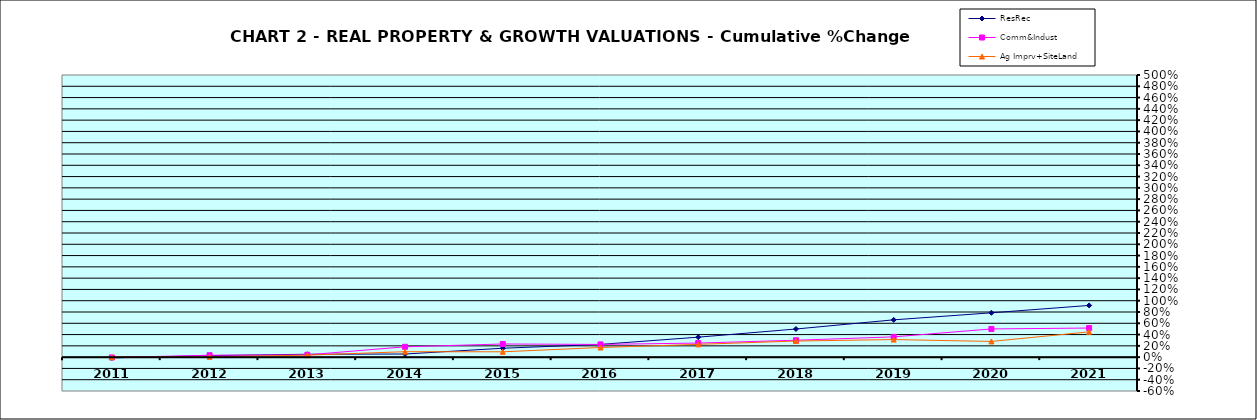
| Category | ResRec | Comm&Indust | Ag Imprv+SiteLand |
|---|---|---|---|
| 2011.0 | -0.013 | -0.006 | 0 |
| 2012.0 | 0.027 | 0.034 | 0.006 |
| 2013.0 | 0.051 | 0.041 | 0.035 |
| 2014.0 | 0.055 | 0.183 | 0.096 |
| 2015.0 | 0.158 | 0.233 | 0.095 |
| 2016.0 | 0.226 | 0.225 | 0.171 |
| 2017.0 | 0.354 | 0.249 | 0.227 |
| 2018.0 | 0.499 | 0.299 | 0.286 |
| 2019.0 | 0.661 | 0.359 | 0.311 |
| 2020.0 | 0.786 | 0.5 | 0.279 |
| 2021.0 | 0.917 | 0.516 | 0.448 |